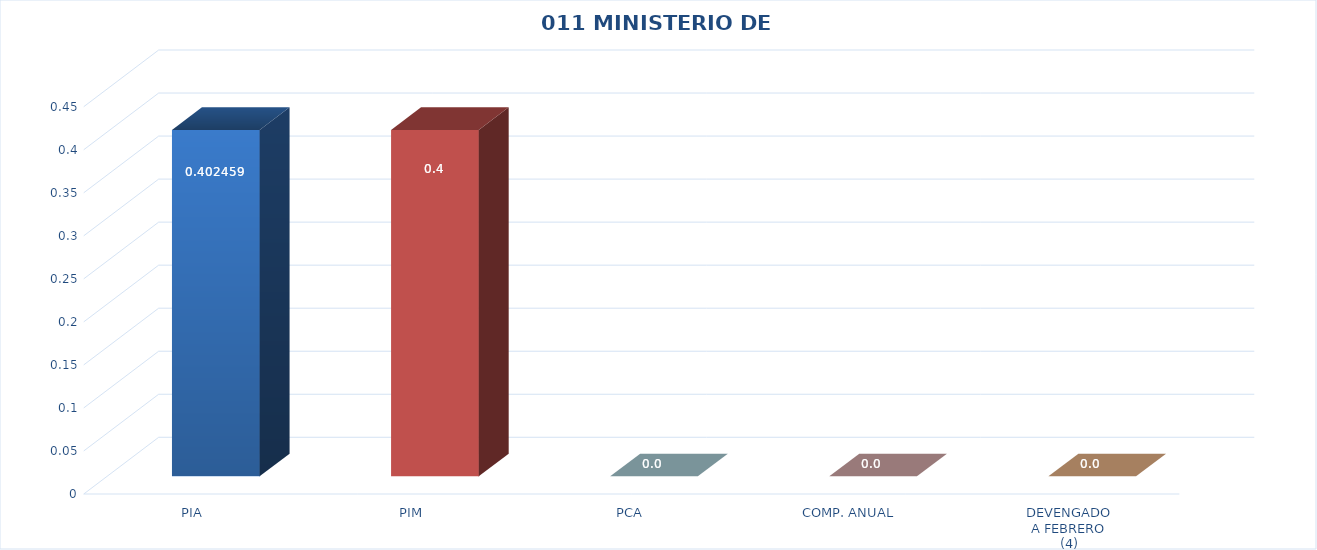
| Category | 011 MINISTERIO DE SALUD |
|---|---|
| PIA | 0.402 |
| PIM | 0.402 |
| PCA | 0 |
| COMP. ANUAL | 0 |
| DEVENGADO
A FEBRERO
(4) | 0 |